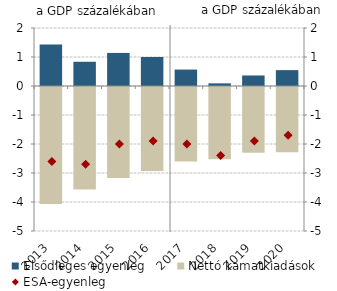
| Category | Elsődleges egyenleg |
|---|---|
| 2013.0 | 1.435 |
| 2014.0 | 0.836 |
| 2015.0 | 1.14 |
| 2016.0 | 1 |
| 2017.0 | 0.566 |
| 2018.0 | 0.091 |
| 2019.0 | 0.363 |
| 2020.0 | 0.547 |